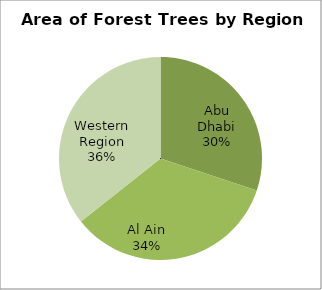
| Category | Series 0 |
|---|---|
| Abu Dhabi | 7675 |
| Al Ain | 8720 |
| Western Region | 9084 |